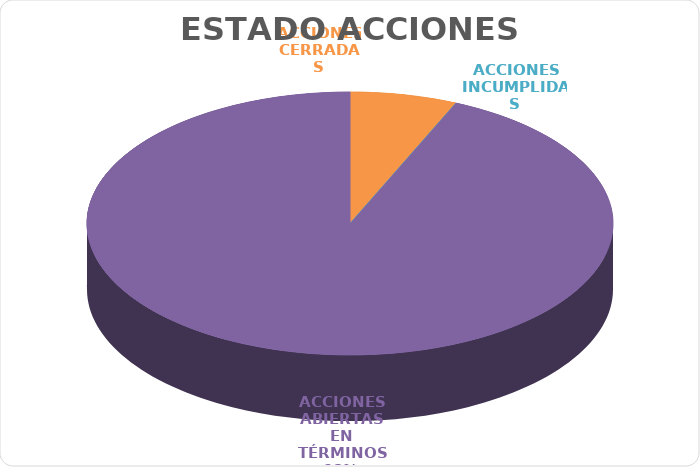
| Category | Series 0 |
|---|---|
| ACCIONES CERRADAS | 6 |
| ACCIONES INCUMPLIDAS | 0 |
| ACCIONES ABIERTAS EN TÉRMINOS | 85 |